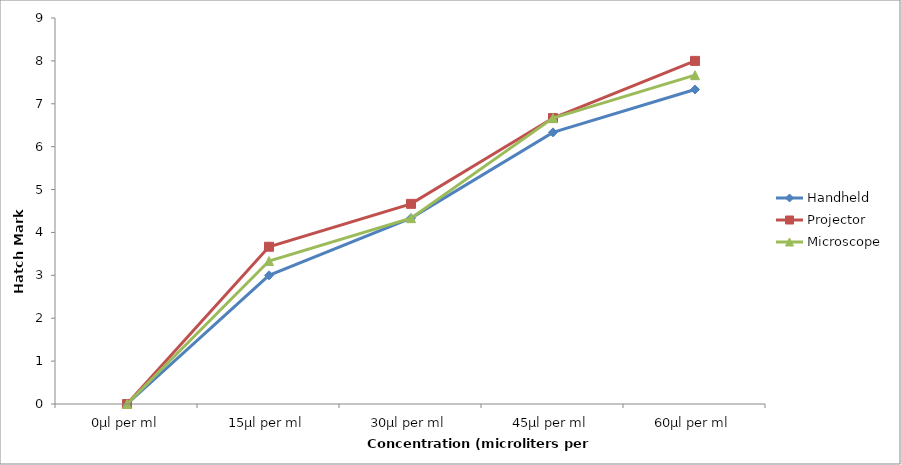
| Category | Handheld | Projector | Microscope |
|---|---|---|---|
| 0µl per ml | 0 | 0 | 0 |
| 15µl per ml | 3 | 3.667 | 3.333 |
| 30µl per ml | 4.333 | 4.667 | 4.333 |
| 45µl per ml | 6.333 | 6.667 | 6.667 |
| 60µl per ml | 7.333 | 8 | 7.667 |